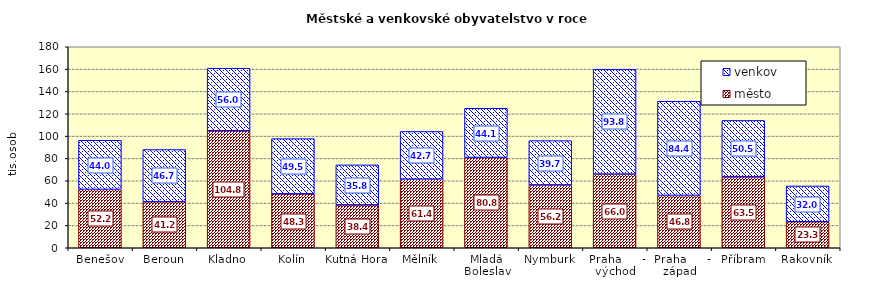
| Category | město | venkov |
|---|---|---|
| Benešov | 52247 | 44026 |
| Beroun | 41244 | 46720 |
| Kladno | 104799 | 55968 |
| Kolín | 48253 | 49452 |
| Kutná Hora | 38409 | 35828 |
| Mělník | 61420 | 42731 |
| Mladá Boleslav | 80809 | 44134 |
| Nymburk | 56215 | 39748 |
| Praha     - východ | 65953 | 93812 |
| Praha     - západ | 46848 | 84358 |
| Příbram | 63489 | 50544 |
| Rakovník | 23299 | 32030 |